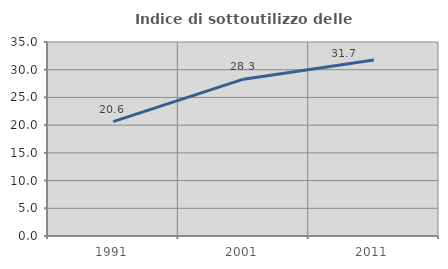
| Category | Indice di sottoutilizzo delle abitazioni  |
|---|---|
| 1991.0 | 20.635 |
| 2001.0 | 28.293 |
| 2011.0 | 31.735 |